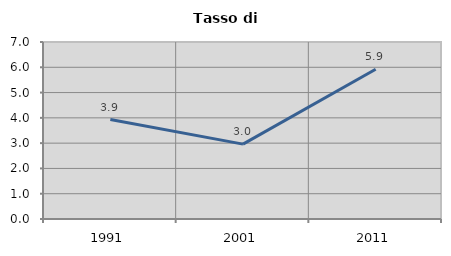
| Category | Tasso di disoccupazione   |
|---|---|
| 1991.0 | 3.934 |
| 2001.0 | 2.96 |
| 2011.0 | 5.922 |